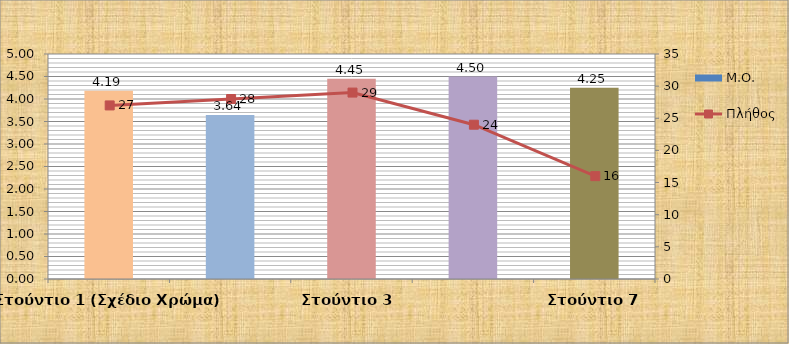
| Category | Μ.Ο. |
|---|---|
| Στούντιο 1 (Σχέδιο Χρώμα) | 4.185 |
| Εργαστήρια Ελεύθερου Σχεδίου 1 | 3.643 |
| Στούντιο 3  | 4.448 |
| Στούντιο 5 | 4.5 |
| Στούντιο 7 | 4.25 |